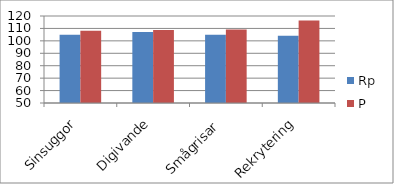
| Category | Rp | P |
|---|---|---|
| Sinsuggor | 104.839 | 108.108 |
| Digivande | 107.143 | 108.696 |
| Smågrisar  | 104.972 | 109.091 |
| Rekrytering | 104.027 | 116.279 |